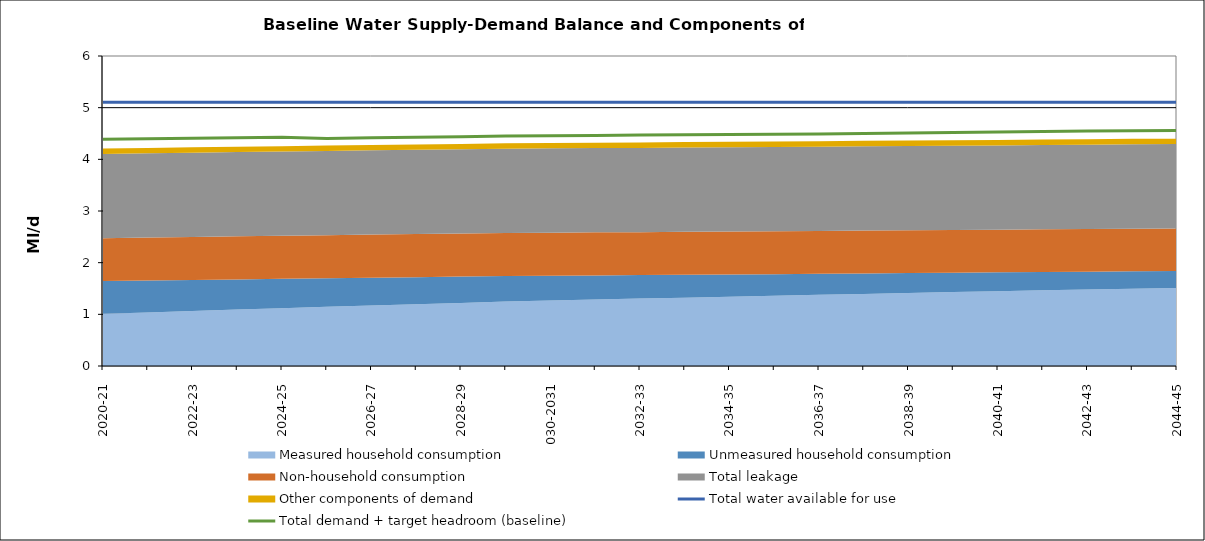
| Category | Total water available for use | Total demand + target headroom (baseline) |
|---|---|---|
| 0 | 5.102 | 4.388 |
| 1 | 5.102 | 4.399 |
| 2 | 5.102 | 4.409 |
| 3 | 5.102 | 4.417 |
| 4 | 5.102 | 4.429 |
| 5 | 5.102 | 4.404 |
| 6 | 5.102 | 4.419 |
| 7 | 5.102 | 4.428 |
| 8 | 5.102 | 4.437 |
| 9 | 5.102 | 4.45 |
| 10 | 5.102 | 4.455 |
| 11 | 5.102 | 4.46 |
| 12 | 5.102 | 4.47 |
| 13 | 5.102 | 4.475 |
| 14 | 5.102 | 4.483 |
| 15 | 5.102 | 4.484 |
| 16 | 5.102 | 4.49 |
| 17 | 5.102 | 4.5 |
| 18 | 5.102 | 4.512 |
| 19 | 5.102 | 4.521 |
| 20 | 5.102 | 4.529 |
| 21 | 5.102 | 4.539 |
| 22 | 5.102 | 4.548 |
| 23 | 5.102 | 4.552 |
| 24 | 5.102 | 4.56 |